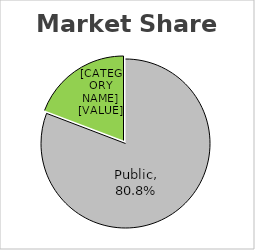
| Category | Amount |
|---|---|
| Public | 0.808 |
| Non Public | 0.192 |